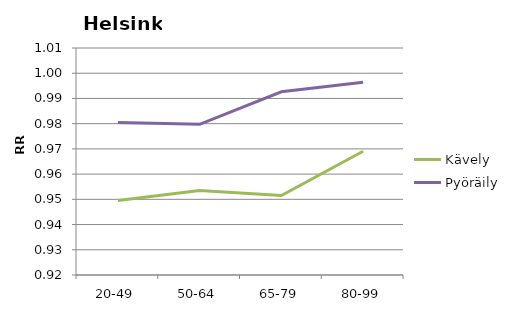
| Category | Kävely | Pyöräily |
|---|---|---|
| 20-49 | 0.95 | 0.98 |
| 50-64 | 0.954 | 0.98 |
| 65-79 | 0.952 | 0.993 |
| 80-99 | 0.969 | 0.996 |